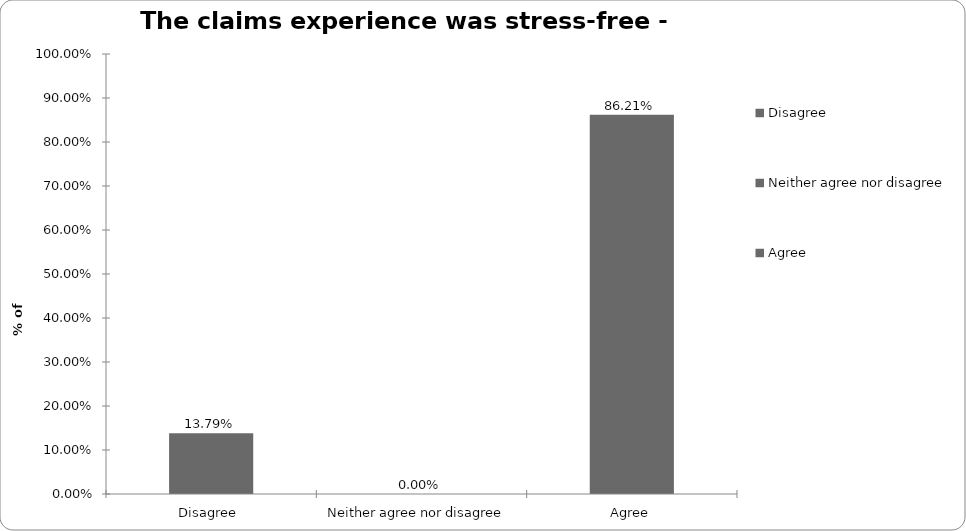
| Category | Motor |
|---|---|
| Disagree  | 0.138 |
| Neither agree nor disagree  | 0 |
| Agree | 0.862 |